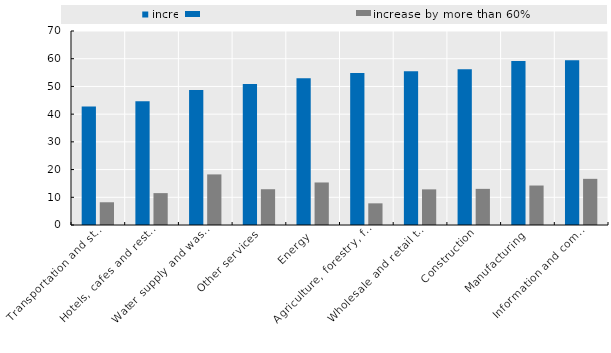
| Category | increase | increase by more than 60% |
|---|---|---|
| Transportation and storage | 42.773 | 8.204 |
| Hotels, cafes and restaurants | 44.673 | 11.503 |
| Water supply and waste management | 48.722 | 18.256 |
| Other services | 50.848 | 12.907 |
| Energy | 52.961 | 15.345 |
| Agriculture, forestry, fishing and mining | 54.83 | 7.817 |
| Wholesale and retail trade | 55.45 | 12.858 |
| Construction | 56.204 | 13.041 |
| Manufacturing | 59.144 | 14.243 |
| Information and communication | 59.49 | 16.655 |